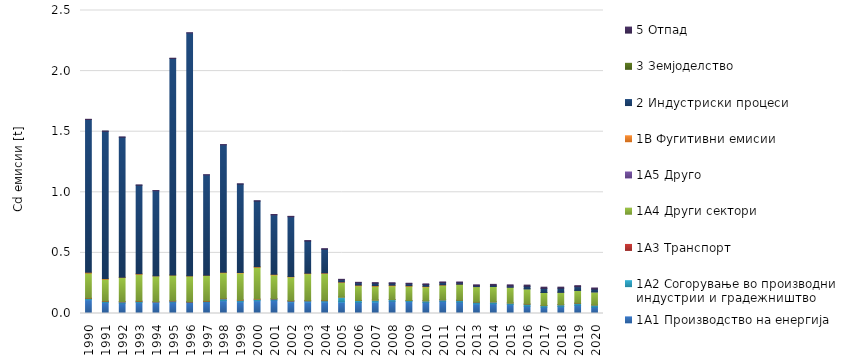
| Category | 1A1 | 1A2 | 1A3 | 1A4 | 1A5 | 1B | 2 | 3 | 5 |
|---|---|---|---|---|---|---|---|---|---|
| 1990.0 | 0.114 | 0.01 | 0.003 | 0.207 | 0 | 0.006 | 1.261 | 0 | 0.002 |
| 1991.0 | 0.09 | 0.009 | 0.003 | 0.18 | 0 | 0.005 | 1.215 | 0 | 0.002 |
| 1992.0 | 0.086 | 0.01 | 0.003 | 0.197 | 0 | 0.003 | 1.156 | 0 | 0.002 |
| 1993.0 | 0.09 | 0.009 | 0.003 | 0.221 | 0 | 0.005 | 0.73 | 0 | 0.002 |
| 1994.0 | 0.089 | 0.006 | 0.003 | 0.211 | 0 | 0.001 | 0.702 | 0 | 0.002 |
| 1995.0 | 0.094 | 0.008 | 0.004 | 0.211 | 0 | 0.001 | 1.787 | 0 | 0.002 |
| 1996.0 | 0.093 | 0.002 | 0.004 | 0.211 | 0 | 0.004 | 2.002 | 0 | 0.002 |
| 1997.0 | 0.095 | 0.005 | 0.004 | 0.211 | 0 | 0.002 | 0.827 | 0 | 0.002 |
| 1998.0 | 0.106 | 0.015 | 0.004 | 0.211 | 0 | 0.004 | 1.052 | 0 | 0.002 |
| 1999.0 | 0.097 | 0.012 | 0.004 | 0.222 | 0 | 0.004 | 0.73 | 0 | 0.002 |
| 2000.0 | 0.106 | 0.01 | 0.004 | 0.262 | 0 | 0.005 | 0.541 | 0 | 0.002 |
| 2001.0 | 0.111 | 0.009 | 0.003 | 0.195 | 0 | 0.005 | 0.49 | 0 | 0.003 |
| 2002.0 | 0.096 | 0.007 | 0.004 | 0.195 | 0 | 0.003 | 0.494 | 0 | 0.003 |
| 2003.0 | 0.096 | 0.009 | 0.003 | 0.22 | 0 | 0.004 | 0.266 | 0 | 0.003 |
| 2004.0 | 0.096 | 0.01 | 0.003 | 0.221 | 0 | 0.005 | 0.196 | 0 | 0.004 |
| 2005.0 | 0.096 | 0.04 | 0.001 | 0.12 | 0 | 0.005 | 0.017 | 0 | 0.004 |
| 2006.0 | 0.092 | 0.015 | 0.001 | 0.121 | 0 | 0.005 | 0.019 | 0 | 0.004 |
| 2007.0 | 0.095 | 0.016 | 0.001 | 0.114 | 0 | 0.005 | 0.02 | 0 | 0.004 |
| 2008.0 | 0.101 | 0.014 | 0.001 | 0.112 | 0 | 0.005 | 0.016 | 0 | 0.004 |
| 2009.0 | 0.098 | 0.009 | 0.001 | 0.117 | 0 | 0.005 | 0.015 | 0 | 0.005 |
| 2010.0 | 0.091 | 0.013 | 0.001 | 0.114 | 0 | 0.004 | 0.015 | 0 | 0.005 |
| 2011.0 | 0.101 | 0.012 | 0.001 | 0.12 | 0 | 0.004 | 0.017 | 0 | 0.006 |
| 2012.0 | 0.095 | 0.015 | 0.001 | 0.13 | 0 | 0.001 | 0.011 | 0 | 0.007 |
| 2013.0 | 0.08 | 0.013 | 0.001 | 0.127 | 0 | 0 | 0.008 | 0 | 0.007 |
| 2014.0 | 0.082 | 0.014 | 0.001 | 0.126 | 0 | 0 | 0.01 | 0 | 0.007 |
| 2015.0 | 0.074 | 0.013 | 0.001 | 0.131 | 0 | 0 | 0.01 | 0 | 0.009 |
| 2016.0 | 0.061 | 0.016 | 0.001 | 0.126 | 0 | 0 | 0.021 | 0 | 0.009 |
| 2017.0 | 0.053 | 0.013 | 0.001 | 0.107 | 0 | 0 | 0.034 | 0 | 0.01 |
| 2018.0 | 0.057 | 0.015 | 0.001 | 0.102 | 0 | 0 | 0.033 | 0 | 0.008 |
| 2019.0 | 0.068 | 0.016 | 0.001 | 0.105 | 0 | 0 | 0.03 | 0 | 0.009 |
| 2020.0 | 0.053 | 0.017 | 0.001 | 0.107 | 0 | 0 | 0.023 | 0 | 0.009 |